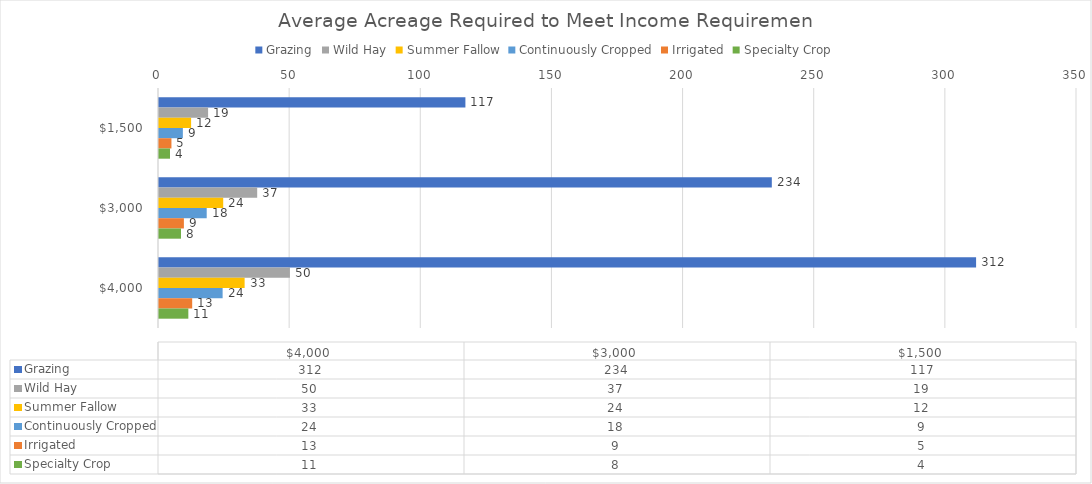
| Category | Grazing | Wild Hay | Summer Fallow | Continuously Cropped | Irrigated | Specialty Crop |
|---|---|---|---|---|---|---|
| 1500.0 | 116.822 | 18.718 | 12.241 | 9.096 | 4.745 | 4.195 |
| 3000.0 | 233.645 | 37.436 | 24.482 | 18.191 | 9.491 | 8.389 |
| 4000.0 | 311.526 | 49.915 | 32.643 | 24.255 | 12.655 | 11.186 |